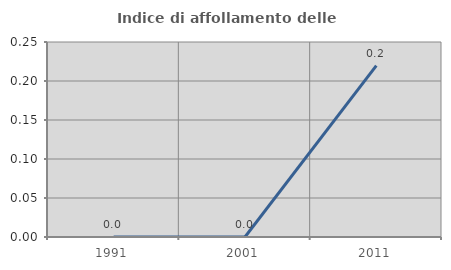
| Category | Indice di affollamento delle abitazioni  |
|---|---|
| 1991.0 | 0 |
| 2001.0 | 0 |
| 2011.0 | 0.22 |